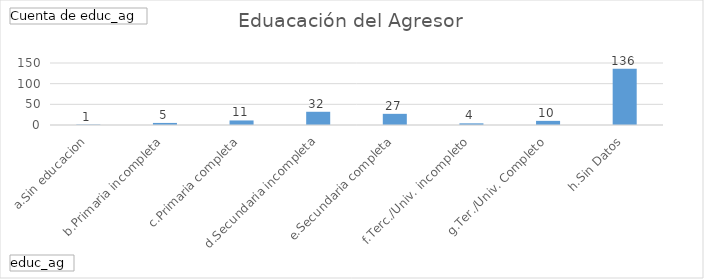
| Category | Total |
|---|---|
| a.Sin educacion | 1 |
| b.Primaria incompleta | 5 |
| c.Primaria completa | 11 |
| d.Secundaria incompleta | 32 |
| e.Secundaria completa | 27 |
| f.Terc./Univ. incompleto | 4 |
| g.Ter./Univ. Completo | 10 |
| h.Sin Datos | 136 |